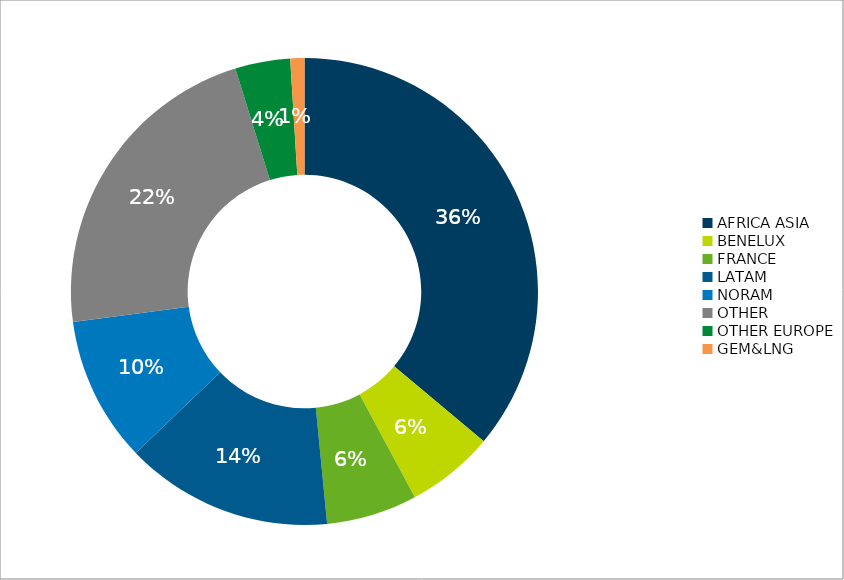
| Category | Total |
|---|---|
| AFRICA ASIA | 40584.917 |
| BENELUX | 6854.147 |
| FRANCE | 7072.88 |
| LATAM | 16192.808 |
| NORAM | 11322.5 |
| OTHER | 25090.784 |
| OTHER EUROPE | 4283.517 |
| GEM&LNG | 1100 |